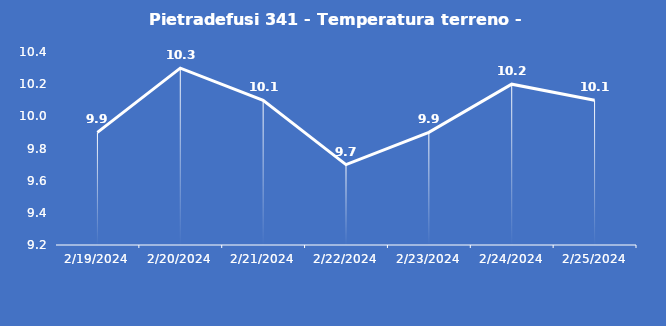
| Category | Pietradefusi 341 - Temperatura terreno - Grezzo (°C) |
|---|---|
| 2/19/24 | 9.9 |
| 2/20/24 | 10.3 |
| 2/21/24 | 10.1 |
| 2/22/24 | 9.7 |
| 2/23/24 | 9.9 |
| 2/24/24 | 10.2 |
| 2/25/24 | 10.1 |